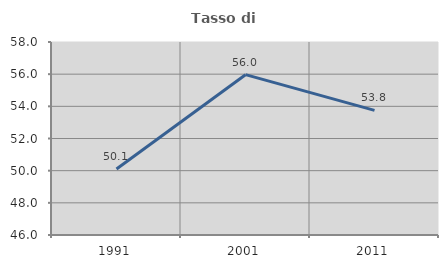
| Category | Tasso di occupazione   |
|---|---|
| 1991.0 | 50.104 |
| 2001.0 | 55.969 |
| 2011.0 | 53.75 |